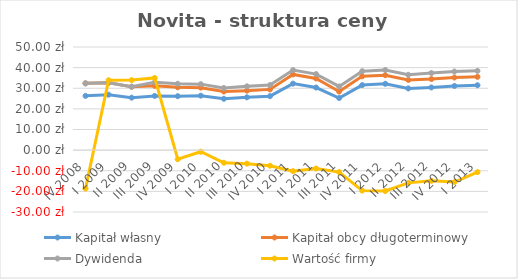
| Category | Kapitał własny | Kapitał obcy długoterminowy | Dywidenda | Wartość firmy |
|---|---|---|---|---|
| IV 2008 | 26.31 | 6.068 | 0 | -18.628 |
| I 2009 | 26.881 | 5.772 | 0 | 1.227 |
| II 2009 | 25.431 | 5.314 | 0 | 3.205 |
| III 2009 | 26.279 | 4.919 | 1.7 | 2.102 |
| IV 2009 | 26.144 | 4.321 | 1.7 | -4.405 |
| I 2010 | 26.399 | 3.892 | 1.7 | -0.771 |
| II 2010 | 24.902 | 3.513 | 1.7 | -6.115 |
| III 2010 | 25.602 | 3.23 | 2.1 | -6.553 |
| IV 2010 | 26.162 | 3.283 | 2.1 | -7.546 |
| I 2011 | 32.239 | 4.467 | 2.1 | -10.206 |
| II 2011 | 30.348 | 4.418 | 2.1 | -8.906 |
| III 2011 | 25.265 | 3.116 | 2.5 | -10.661 |
| IV 2011 | 31.534 | 4.24 | 2.5 | -19.624 |
| I 2012 | 32.158 | 4.166 | 2.5 | -19.824 |
| II 2012 | 29.906 | 4.125 | 2.5 | -15.881 |
| III 2012 | 30.387 | 4.073 | 2.9 | -14.86 |
| IV 2012 | 31.098 | 4.099 | 2.9 | -15.497 |
| I 2013 | 31.456 | 4.08 | 2.9 | -10.686 |